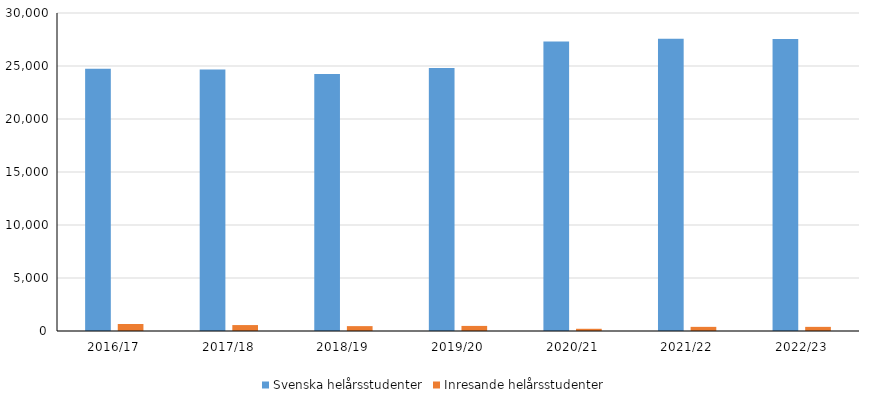
| Category | Svenska helårsstudenter | Inresande helårsstudenter  |
|---|---|---|
| 2016/17 | 24740 | 660 |
| 2017/18 | 24670 | 560 |
| 2018/19 | 24240 | 460 |
| 2019/20 | 24800 | 480 |
| 2020/21 | 27310 | 210 |
| 2021/22 | 27580 | 390 |
| 2022/23 | 27540 | 390 |